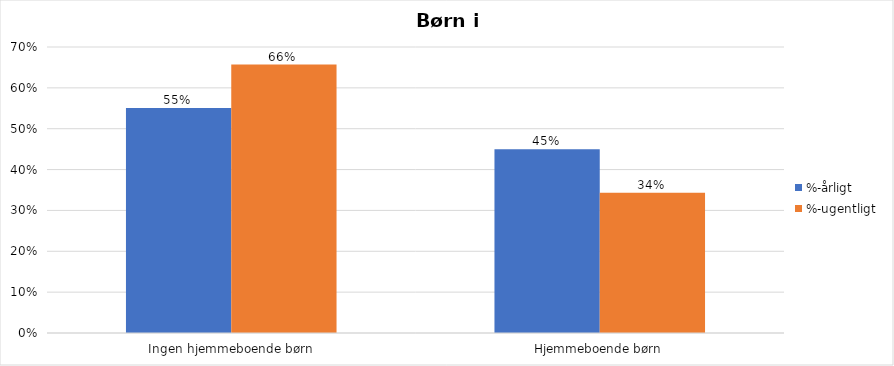
| Category | %-årligt | %-ugentligt |
|---|---|---|
| Ingen hjemmeboende børn | 0.551 | 0.657 |
| Hjemmeboende børn | 0.449 | 0.343 |